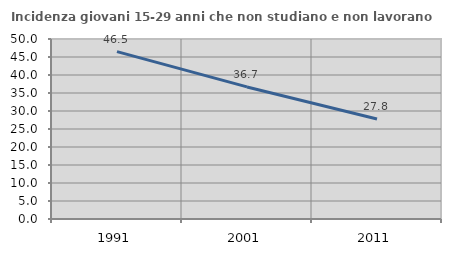
| Category | Incidenza giovani 15-29 anni che non studiano e non lavorano  |
|---|---|
| 1991.0 | 46.487 |
| 2001.0 | 36.688 |
| 2011.0 | 27.798 |